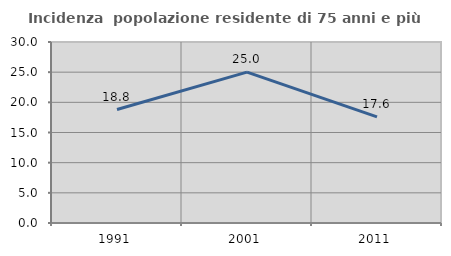
| Category | Incidenza  popolazione residente di 75 anni e più |
|---|---|
| 1991.0 | 18.812 |
| 2001.0 | 25 |
| 2011.0 | 17.597 |